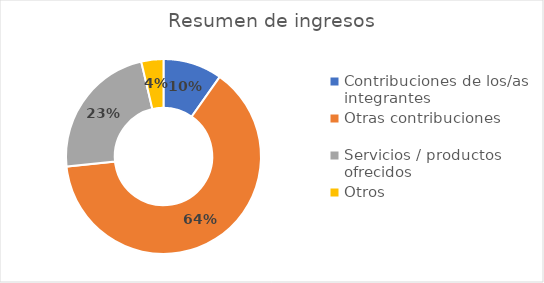
| Category | Series 0 |
|---|---|
| Contribuciones de los/as integrantes | 40 |
| Otras contribuciones | 260 |
| Servicios / productos ofrecidos | 94 |
| Otros | 15 |